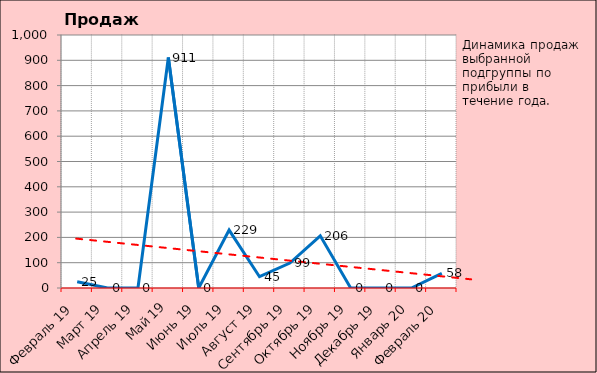
| Category | Прибыль в теч. года |
|---|---|
|   Февраль 19 | 25 |
|   Март 19 | 0 |
|   Апрель 19 | 0 |
|   Май 19 | 911 |
|   Июнь 19 | 0 |
|   Июль 19 | 229 |
|   Август 19 | 44.64 |
|   Сентябрь 19 | 98.58 |
|   Октябрь 19 | 206.21 |
|   Ноябрь 19 | 0 |
|   Декабрь 19 | 0 |
|   Январь 20 | 0 |
|   Февраль 20 | 57.65 |